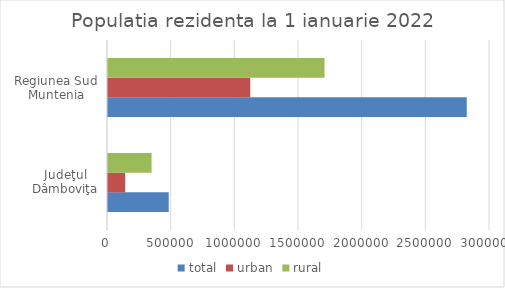
| Category | total | urban | rural |
|---|---|---|---|
| Judeţul Dâmboviţa | 476963 | 134861 | 342102 |
| Regiunea Sud Muntenia | 2817439 | 1116999 | 1700440 |